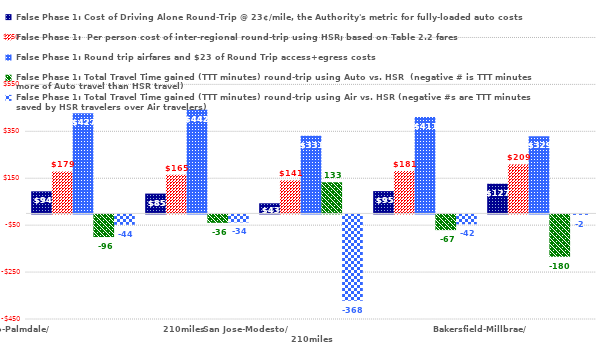
| Category | False Phase 1: Cost of Driving Alone Round-Trip @ 23¢/mile, the Authority's metric for fully-loaded auto costs | False Phase 1:  Per person cost of inter-regional round-trip using HSR; based on Table 2.2 fares | False Phase 1: Round trip airfares and $23 of Round Trip access+egress costs | False Phase 1: Total Travel Time gained (TTT minutes) round-trip using Auto vs. HSR  (negative # is TTT minutes more of Auto travel than HSR travel) | False Phase 1: Total Travel Time gained (TTT minutes) round-trip using Air vs. HSR (negative #s are TTT minutes saved by HSR travelers over Air travelers) |
|---|---|---|---|---|---|
| Fresno-Palmdale/                                      210miles | 94.3 | 179 | 427 | -96.4 | -44 |
| KT Hanford-Burbank (BUR)/                              228miles | 84.64 | 165 | 442 | -35.8 | -34 |
| San Jose-Modesto/                                                 210miles | 43.24 | 141 | 331 | 132.8 | -368 |
| Fresno-Burbank (BUR)/                         261miles | 95.22 | 181 | 411 | -66.8 | -42 |
| Bakersfield-Millbrae/                           291miles | 126.5 | 209 | 329 | -180.4 | -2 |